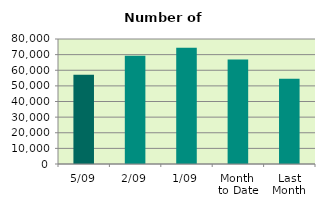
| Category | Series 0 |
|---|---|
| 5/09 | 57106 |
| 2/09 | 69204 |
| 1/09 | 74392 |
| Month 
to Date | 66900.667 |
| Last
Month | 54581.565 |